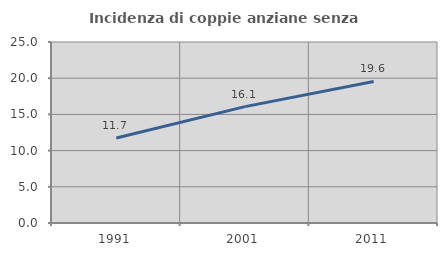
| Category | Incidenza di coppie anziane senza figli  |
|---|---|
| 1991.0 | 11.749 |
| 2001.0 | 16.076 |
| 2011.0 | 19.551 |